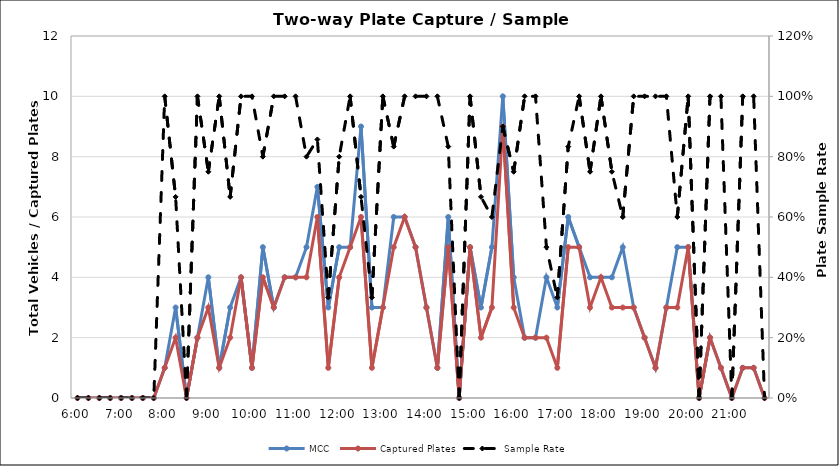
| Category | MCC | Captured Plates |
|---|---|---|
| 0.25 | 0 | 0 |
| 0.260416666666667 | 0 | 0 |
| 0.270833333333333 | 0 | 0 |
| 0.28125 | 0 | 0 |
| 0.291666666666667 | 0 | 0 |
| 0.302083333333333 | 0 | 0 |
| 0.3125 | 0 | 0 |
| 0.322916666666667 | 0 | 0 |
| 0.333333333333333 | 1 | 1 |
| 0.34375 | 3 | 2 |
| 0.354166666666667 | 0 | 0 |
| 0.364583333333333 | 2 | 2 |
| 0.375 | 4 | 3 |
| 0.385416666666667 | 1 | 1 |
| 0.395833333333333 | 3 | 2 |
| 0.40625 | 4 | 4 |
| 0.416666666666667 | 1 | 1 |
| 0.427083333333333 | 5 | 4 |
| 0.4375 | 3 | 3 |
| 0.447916666666667 | 4 | 4 |
| 0.458333333333333 | 4 | 4 |
| 0.46875 | 5 | 4 |
| 0.479166666666667 | 7 | 6 |
| 0.489583333333333 | 3 | 1 |
| 0.5 | 5 | 4 |
| 0.510416666666667 | 5 | 5 |
| 0.520833333333333 | 9 | 6 |
| 0.53125 | 3 | 1 |
| 0.541666666666667 | 3 | 3 |
| 0.552083333333333 | 6 | 5 |
| 0.5625 | 6 | 6 |
| 0.572916666666667 | 5 | 5 |
| 0.583333333333333 | 3 | 3 |
| 0.59375 | 1 | 1 |
| 0.604166666666667 | 6 | 5 |
| 0.614583333333333 | 0 | 0 |
| 0.625 | 5 | 5 |
| 0.635416666666667 | 3 | 2 |
| 0.645833333333333 | 5 | 3 |
| 0.65625 | 10 | 9 |
| 0.666666666666667 | 4 | 3 |
| 0.677083333333333 | 2 | 2 |
| 0.6875 | 2 | 2 |
| 0.697916666666667 | 4 | 2 |
| 0.708333333333333 | 3 | 1 |
| 0.71875 | 6 | 5 |
| 0.729166666666667 | 5 | 5 |
| 0.739583333333333 | 4 | 3 |
| 0.75 | 4 | 4 |
| 0.760416666666667 | 4 | 3 |
| 0.770833333333333 | 5 | 3 |
| 0.78125 | 3 | 3 |
| 0.791666666666667 | 2 | 2 |
| 0.802083333333333 | 1 | 1 |
| 0.8125 | 3 | 3 |
| 0.822916666666667 | 5 | 3 |
| 0.833333333333333 | 5 | 5 |
| 0.84375 | 0 | 0 |
| 0.854166666666667 | 2 | 2 |
| 0.864583333333333 | 1 | 1 |
| 0.875 | 0 | 0 |
| 0.885416666666667 | 1 | 1 |
| 0.895833333333333 | 1 | 1 |
| 0.90625 | 0 | 0 |